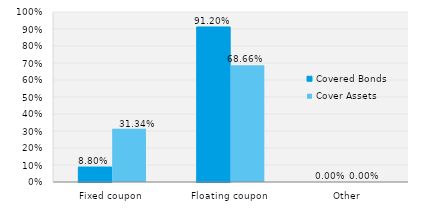
| Category | Covered Bonds | Cover Assets |
|---|---|---|
| Fixed coupon | 0.088 | 0.313 |
| Floating coupon | 0.912 | 0.687 |
| Other | 0 | 0 |